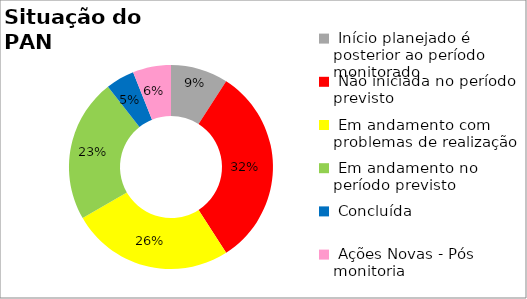
| Category | Series 0 |
|---|---|
|  Início planejado é posterior ao período monitorado | 0.091 |
|  Não iniciada no período previsto | 0.318 |
|  Em andamento com problemas de realização | 0.258 |
|  Em andamento no período previsto  | 0.227 |
|  Concluída | 0.045 |
|  Ações Novas - Pós monitoria | 0.061 |